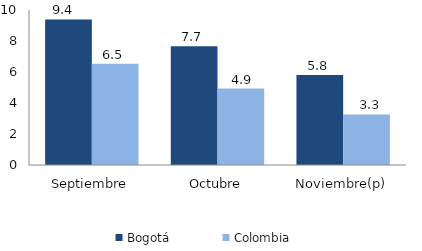
| Category | Bogotá | Colombia |
|---|---|---|
| Septiembre | 9.389 | 6.532 |
| Octubre | 7.669 | 4.928 |
| Noviembre(p) | 5.808 | 3.262 |